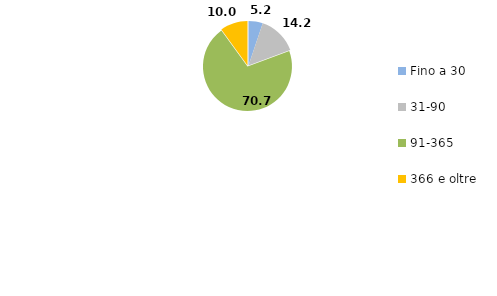
| Category | Series 0 |
|---|---|
| Fino a 30 | 5.2 |
| 31-90 | 14.2 |
| 91-365 | 70.7 |
| 366 e oltre | 10 |